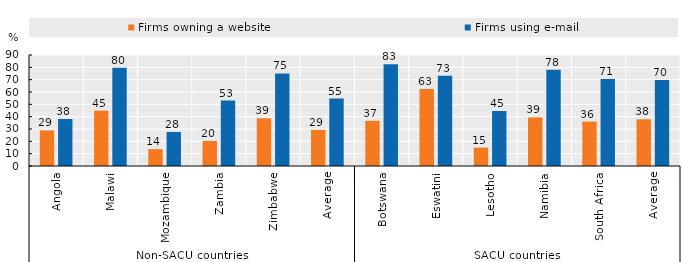
| Category | Firms owning a website | Firms using e-mail |
|---|---|---|
| 0 | 28.9 | 38.1 |
| 1 | 44.9 | 79.6 |
| 2 | 13.7 | 27.6 |
| 3 | 20.3 | 53.1 |
| 4 | 38.7 | 75.1 |
| 5 | 29.3 | 54.7 |
| 6 | 36.6 | 82.5 |
| 7 | 62.5 | 73.1 |
| 8 | 14.9 | 44.6 |
| 9 | 39.4 | 78.1 |
| 10 | 36 | 70.5 |
| 11 | 37.88 | 69.76 |